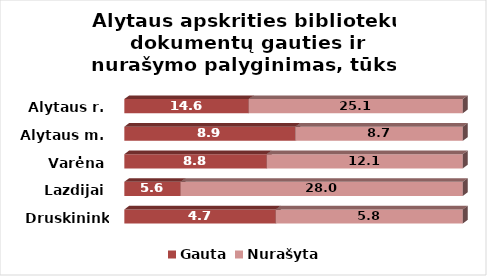
| Category | Gauta | Nurašyta |
|---|---|---|
| Druskininkai | 4.7 | 5.8 |
| Lazdijai | 5.6 | 28 |
| Varėna | 8.8 | 12.1 |
| Alytaus m. | 8.9 | 8.7 |
| Alytaus r. | 14.6 | 25.1 |